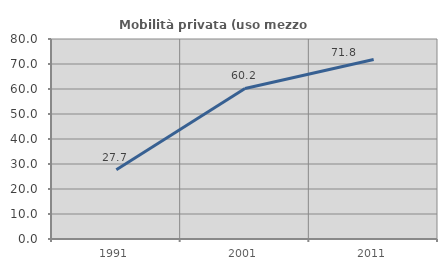
| Category | Mobilità privata (uso mezzo privato) |
|---|---|
| 1991.0 | 27.728 |
| 2001.0 | 60.22 |
| 2011.0 | 71.802 |